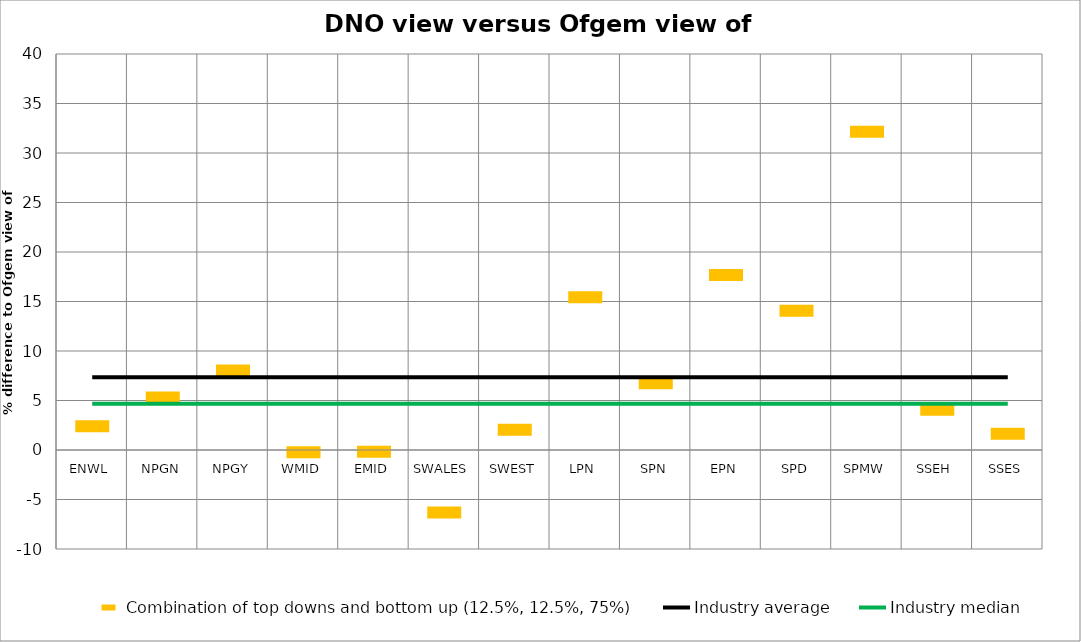
| Category | Combination of top downs and bottom up (12.5%, 12.5%, 75%) | Industry average | Industry median |
|---|---|---|---|
| ENWL | 2.402 | 7.349 | 4.675 |
| NPGN | 5.292 | 7.349 | 4.675 |
| NPGY | 8.035 | 7.349 | 4.675 |
| WMID | -0.22 | 7.349 | 4.675 |
| EMID | -0.167 | 7.349 | 4.675 |
| SWALES | -6.303 | 7.349 | 4.675 |
| SWEST | 2.056 | 7.349 | 4.675 |
| LPN | 15.435 | 7.349 | 4.675 |
| SPN | 6.75 | 7.349 | 4.675 |
| EPN | 17.681 | 7.349 | 4.675 |
| SPD | 14.075 | 7.349 | 4.675 |
| SPMW | 32.144 | 7.349 | 4.675 |
| SSEH | 4.058 | 7.349 | 4.675 |
| SSES | 1.653 | 7.349 | 4.675 |